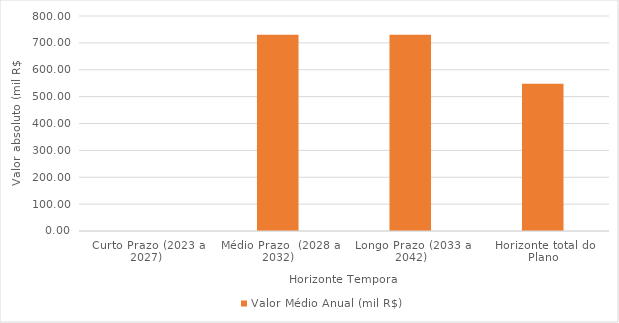
| Category | Valor Médio Anual (mil R$) |
|---|---|
| Curto Prazo (2023 a 2027) | 0 |
| Médio Prazo  (2028 a 2032) | 730 |
| Longo Prazo (2033 a 2042) | 730 |
| Horizonte total do Plano | 547.5 |